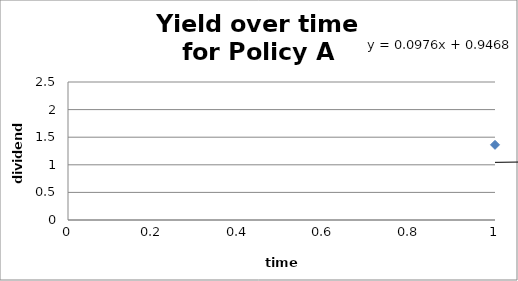
| Category | Series 0 |
|---|---|
| 0 | 1.362 |
| 1 | 1.277 |
| 2 | 1.187 |
| 3 | 1.092 |
| 4 | 1.187 |
| 5 | 1.454 |
| 6 | 1.39 |
| 7 | 1.669 |
| 8 | 2.118 |
| 9 | 2.1 |